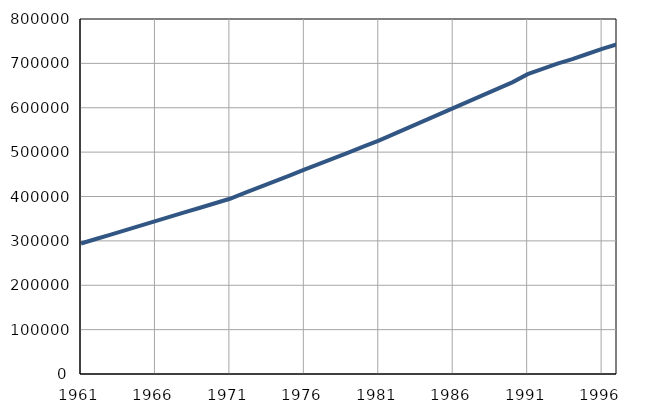
| Category | Population
size |
|---|---|
| 1961.0 | 294054 |
| 1962.0 | 304136 |
| 1963.0 | 314218 |
| 1964.0 | 324300 |
| 1965.0 | 334382 |
| 1966.0 | 344464 |
| 1967.0 | 354546 |
| 1968.0 | 364628 |
| 1969.0 | 374710 |
| 1970.0 | 384792 |
| 1971.0 | 394873 |
| 1972.0 | 407967 |
| 1973.0 | 421061 |
| 1974.0 | 434155 |
| 1975.0 | 447249 |
| 1976.0 | 460343 |
| 1977.0 | 473437 |
| 1978.0 | 486531 |
| 1979.0 | 499625 |
| 1980.0 | 512719 |
| 1981.0 | 525796 |
| 1982.0 | 540461 |
| 1983.0 | 555126 |
| 1984.0 | 569791 |
| 1985.0 | 584456 |
| 1986.0 | 599121 |
| 1987.0 | 613786 |
| 1988.0 | 628451 |
| 1989.0 | 643116 |
| 1990.0 | 657781 |
| 1991.0 | 675700 |
| 1992.0 | 687400 |
| 1993.0 | 699500 |
| 1994.0 | 709600 |
| 1995.0 | 721100 |
| 1996.0 | 732800 |
| 1997.0 | 743100 |